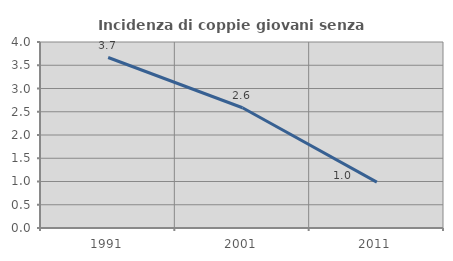
| Category | Incidenza di coppie giovani senza figli |
|---|---|
| 1991.0 | 3.667 |
| 2001.0 | 2.586 |
| 2011.0 | 0.986 |